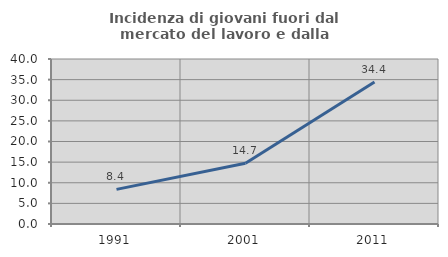
| Category | Incidenza di giovani fuori dal mercato del lavoro e dalla formazione  |
|---|---|
| 1991.0 | 8.392 |
| 2001.0 | 14.706 |
| 2011.0 | 34.409 |